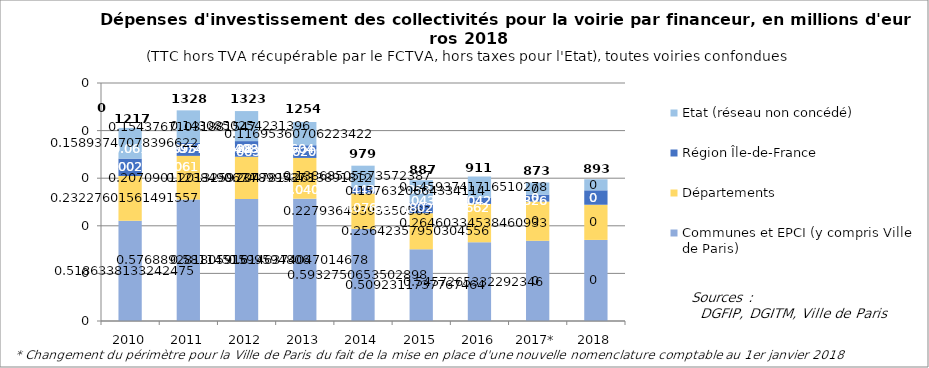
| Category | Communes et EPCI (y compris Ville de Paris) | Départements | Région Île-de-France | Etat (réseau non concédé) |
|---|---|---|---|---|
| 2010 | 631118286.744 | 282653458.491 | 109705569.291 | 193408801.516 |
| 2011 | 765865717.897 | 274928348.633 | 81837100.745 | 204947177.567 |
| 2012 | 768914042.637 | 266374701.298 | 98496758.717 | 189316014.172 |
| 2013 | 770952566.06 | 256861630.541 | 79809383.379 | 146697358.125 |
| 2014 | 580762332.007 | 223129038.539 | 39257625.322 | 135760056.486 |
| 2015 | 451808438.283 | 227508336.018 | 68062726.647 | 139856908.662 |
| 2016 | 496969210.795 | 240962657.526 | 39825455.021 | 132898803.005 |
| 2017* | 505603942.615 | 246902504.698 | 43930999.345 | 76340534.555 |
| 2018 | 511075097.811 | 221721830.86 | 90774367.31 | 69828779.883 |